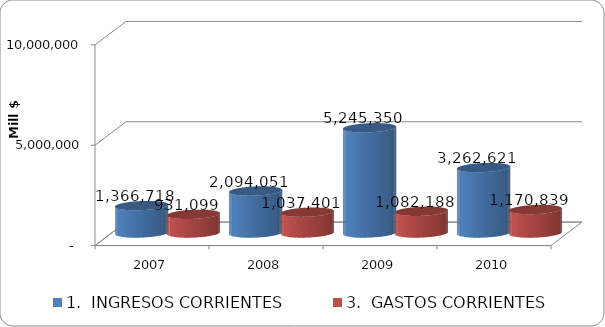
| Category | 1.  INGRESOS CORRIENTES | 3.  GASTOS CORRIENTES |
|---|---|---|
| 2007 | 1366717.644 | 931099.204 |
| 2008 | 2094051.002 | 1037401.381 |
| 2009 | 5245349.538 | 1082188.303 |
| 2010 | 3262621 | 1170839 |